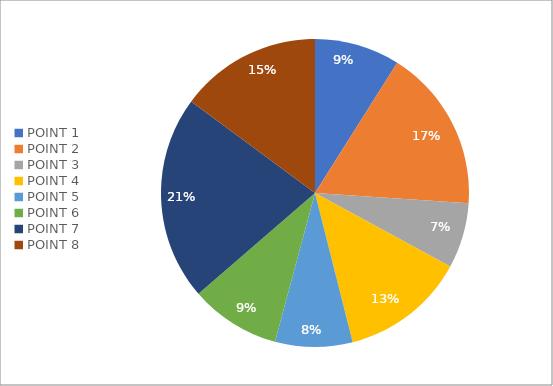
| Category | Series 0 | Series 1 |
|---|---|---|
| POINT 1 | 0.09 | 0.09 |
| POINT 2 | 0.171 | 0.171 |
| POINT 3 | 0.069 | 0.069 |
| POINT 4 | 0.131 | 0.131 |
| POINT 5 | 0.081 | 0.081 |
| POINT 6 | 0.095 | 0.095 |
| POINT 7 | 0.215 | 0.215 |
| POINT 8 | 0.149 | 0.149 |